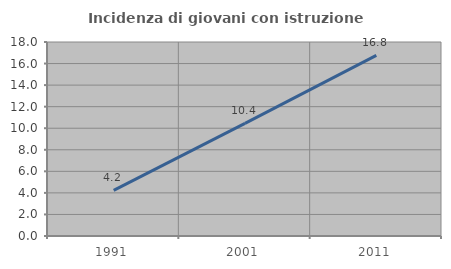
| Category | Incidenza di giovani con istruzione universitaria |
|---|---|
| 1991.0 | 4.225 |
| 2001.0 | 10.448 |
| 2011.0 | 16.754 |